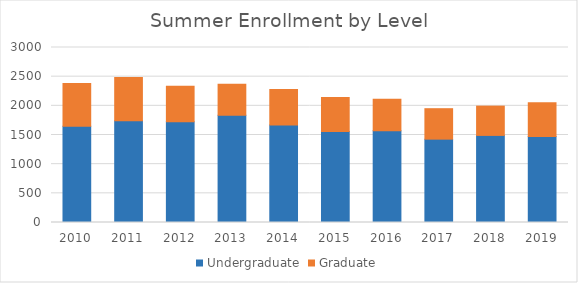
| Category | Undergraduate | Graduate |
|---|---|---|
| 2010 | 1649 | 735 |
| 2011 | 1743 | 743 |
| 2012 | 1726 | 611 |
| 2013 | 1840 | 530 |
| 2014 | 1670 | 612 |
| 2015 | 1562 | 582 |
| 2016 | 1575 | 540 |
| 2017 | 1429 | 522 |
| 2018 | 1493 | 502 |
| 2019 | 1473 | 578 |